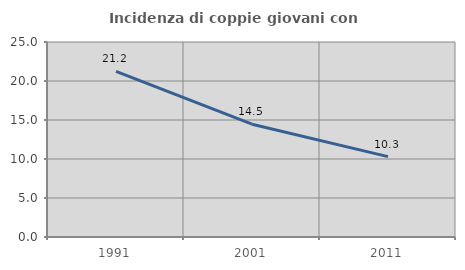
| Category | Incidenza di coppie giovani con figli |
|---|---|
| 1991.0 | 21.221 |
| 2001.0 | 14.462 |
| 2011.0 | 10.305 |